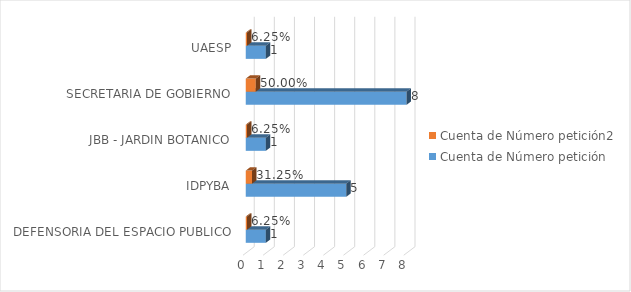
| Category | Cuenta de Número petición | Cuenta de Número petición2 |
|---|---|---|
| DEFENSORIA DEL ESPACIO PUBLICO | 1 | 0.062 |
| IDPYBA | 5 | 0.312 |
| JBB - JARDIN BOTANICO | 1 | 0.062 |
| SECRETARIA DE GOBIERNO | 8 | 0.5 |
| UAESP | 1 | 0.062 |